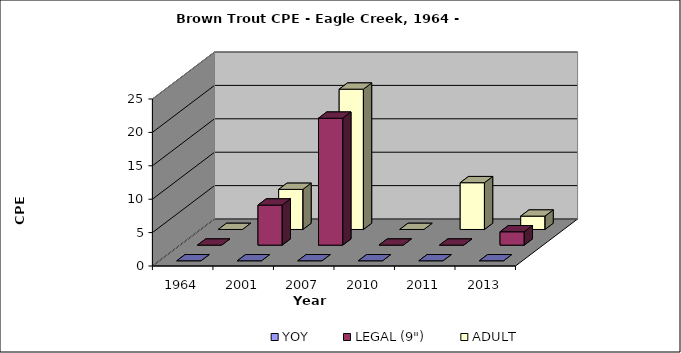
| Category | YOY | LEGAL (9") | ADULT |
|---|---|---|---|
| 1964.0 | 0 | 0 | 0 |
| 2001.0 | 0 | 6 | 6 |
| 2007.0 | 0 | 19 | 21 |
| 2010.0 | 0 | 0 | 0 |
| 2011.0 | 0 | 0 | 7 |
| 2013.0 | 0 | 2 | 2 |